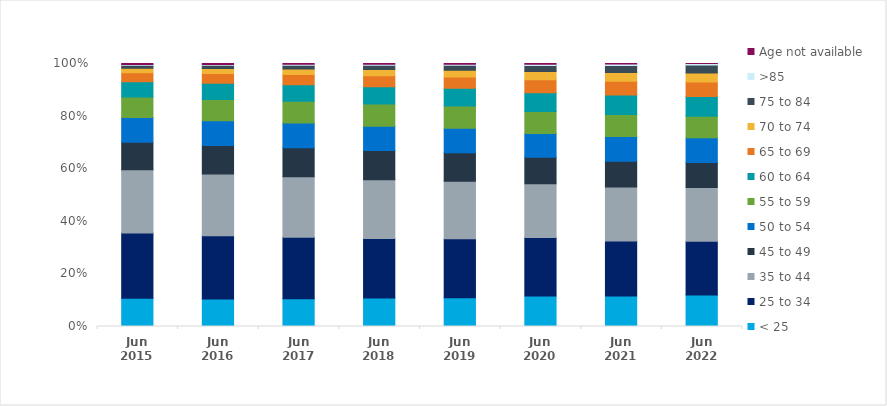
| Category | < 25 | 25 to 34 | 35 to 44 | 45 to 49 | 50 to 54 | 55 to 59 | 60 to 64 | 65 to 69 | 70 to 74 | 75 to 84 | >85 | Age not available |
|---|---|---|---|---|---|---|---|---|---|---|---|---|
| Jun 2015 | 0.107 | 0.248 | 0.241 | 0.105 | 0.094 | 0.077 | 0.058 | 0.035 | 0.017 | 0.011 | 0.003 | 0.004 |
| Jun 2016 | 0.105 | 0.24 | 0.235 | 0.108 | 0.095 | 0.081 | 0.062 | 0.037 | 0.019 | 0.013 | 0.003 | 0.003 |
| Jun 2017 | 0.106 | 0.234 | 0.23 | 0.11 | 0.094 | 0.082 | 0.064 | 0.038 | 0.021 | 0.015 | 0.003 | 0.003 |
| Jun 2018 | 0.109 | 0.226 | 0.224 | 0.11 | 0.093 | 0.084 | 0.066 | 0.041 | 0.024 | 0.017 | 0.004 | 0.003 |
| Jun 2019 | 0.11 | 0.223 | 0.219 | 0.109 | 0.093 | 0.084 | 0.068 | 0.043 | 0.026 | 0.019 | 0.004 | 0.003 |
| Jun 2020 | 0.116 | 0.222 | 0.205 | 0.1 | 0.09 | 0.084 | 0.072 | 0.049 | 0.031 | 0.024 | 0.005 | 0.002 |
| Jun 2021 | 0.116 | 0.21 | 0.205 | 0.098 | 0.094 | 0.084 | 0.074 | 0.052 | 0.033 | 0.026 | 0.005 | 0.002 |
| Jun 2022 | 0.12 | 0.204 | 0.205 | 0.095 | 0.094 | 0.082 | 0.075 | 0.055 | 0.035 | 0.03 | 0.006 | 0 |